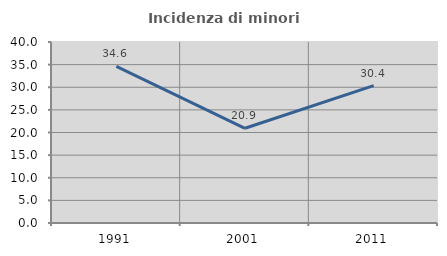
| Category | Incidenza di minori stranieri |
|---|---|
| 1991.0 | 34.615 |
| 2001.0 | 20.93 |
| 2011.0 | 30.351 |